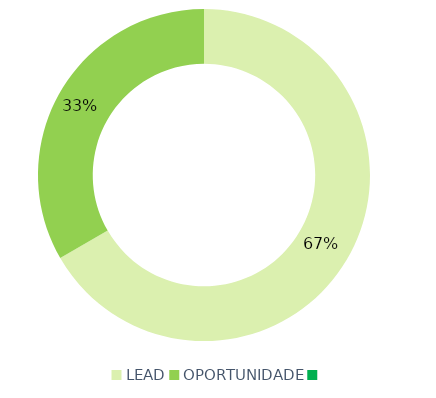
| Category | Series 0 |
|---|---|
| LEAD | 44 |
| OPORTUNIDADE | 22 |